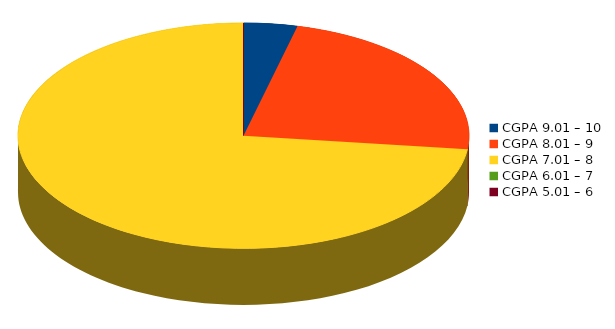
| Category | Number of students |
|---|---|
| CGPA 9.01 – 10 | 1 |
| CGPA 8.01 – 9 | 6 |
| CGPA 7.01 – 8 | 19 |
| CGPA 6.01 – 7 | 0 |
| CGPA 5.01 – 6 | 0 |